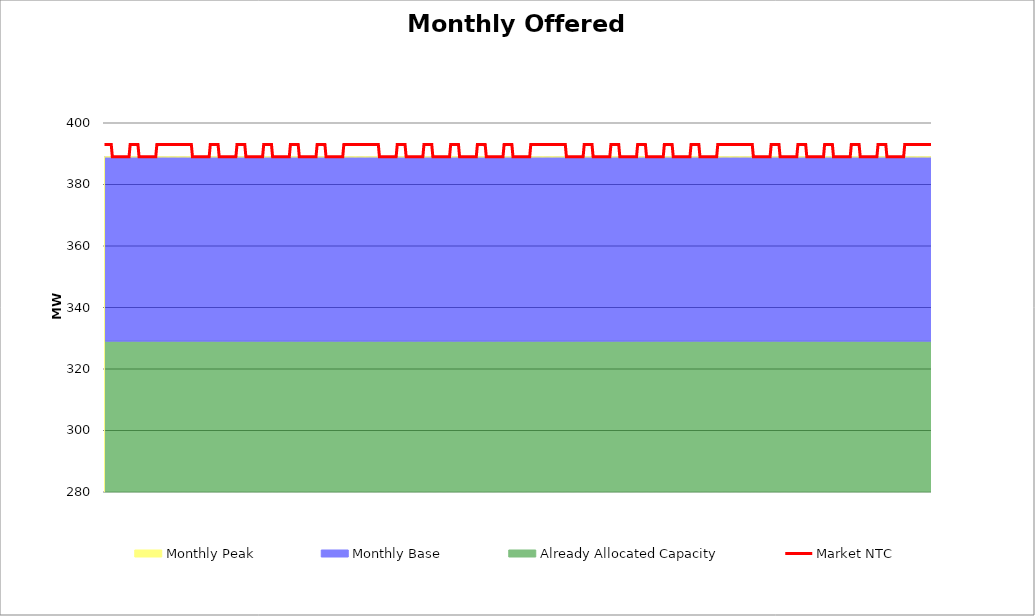
| Category | Market NTC |
|---|---|
| 0 | 393 |
| 1 | 393 |
| 2 | 393 |
| 3 | 393 |
| 4 | 393 |
| 5 | 393 |
| 6 | 393 |
| 7 | 389 |
| 8 | 389 |
| 9 | 389 |
| 10 | 389 |
| 11 | 389 |
| 12 | 389 |
| 13 | 389 |
| 14 | 389 |
| 15 | 389 |
| 16 | 389 |
| 17 | 389 |
| 18 | 389 |
| 19 | 389 |
| 20 | 389 |
| 21 | 389 |
| 22 | 389 |
| 23 | 393 |
| 24 | 393 |
| 25 | 393 |
| 26 | 393 |
| 27 | 393 |
| 28 | 393 |
| 29 | 393 |
| 30 | 393 |
| 31 | 389 |
| 32 | 389 |
| 33 | 389 |
| 34 | 389 |
| 35 | 389 |
| 36 | 389 |
| 37 | 389 |
| 38 | 389 |
| 39 | 389 |
| 40 | 389 |
| 41 | 389 |
| 42 | 389 |
| 43 | 389 |
| 44 | 389 |
| 45 | 389 |
| 46 | 389 |
| 47 | 393 |
| 48 | 393 |
| 49 | 393 |
| 50 | 393 |
| 51 | 393 |
| 52 | 393 |
| 53 | 393 |
| 54 | 393 |
| 55 | 393 |
| 56 | 393 |
| 57 | 393 |
| 58 | 393 |
| 59 | 393 |
| 60 | 393 |
| 61 | 393 |
| 62 | 393 |
| 63 | 393 |
| 64 | 393 |
| 65 | 393 |
| 66 | 393 |
| 67 | 393 |
| 68 | 393 |
| 69 | 393 |
| 70 | 393 |
| 71 | 393 |
| 72 | 393 |
| 73 | 393 |
| 74 | 393 |
| 75 | 393 |
| 76 | 393 |
| 77 | 393 |
| 78 | 393 |
| 79 | 389 |
| 80 | 389 |
| 81 | 389 |
| 82 | 389 |
| 83 | 389 |
| 84 | 389 |
| 85 | 389 |
| 86 | 389 |
| 87 | 389 |
| 88 | 389 |
| 89 | 389 |
| 90 | 389 |
| 91 | 389 |
| 92 | 389 |
| 93 | 389 |
| 94 | 389 |
| 95 | 393 |
| 96 | 393 |
| 97 | 393 |
| 98 | 393 |
| 99 | 393 |
| 100 | 393 |
| 101 | 393 |
| 102 | 393 |
| 103 | 389 |
| 104 | 389 |
| 105 | 389 |
| 106 | 389 |
| 107 | 389 |
| 108 | 389 |
| 109 | 389 |
| 110 | 389 |
| 111 | 389 |
| 112 | 389 |
| 113 | 389 |
| 114 | 389 |
| 115 | 389 |
| 116 | 389 |
| 117 | 389 |
| 118 | 389 |
| 119 | 393 |
| 120 | 393 |
| 121 | 393 |
| 122 | 393 |
| 123 | 393 |
| 124 | 393 |
| 125 | 393 |
| 126 | 393 |
| 127 | 389 |
| 128 | 389 |
| 129 | 389 |
| 130 | 389 |
| 131 | 389 |
| 132 | 389 |
| 133 | 389 |
| 134 | 389 |
| 135 | 389 |
| 136 | 389 |
| 137 | 389 |
| 138 | 389 |
| 139 | 389 |
| 140 | 389 |
| 141 | 389 |
| 142 | 389 |
| 143 | 393 |
| 144 | 393 |
| 145 | 393 |
| 146 | 393 |
| 147 | 393 |
| 148 | 393 |
| 149 | 393 |
| 150 | 393 |
| 151 | 389 |
| 152 | 389 |
| 153 | 389 |
| 154 | 389 |
| 155 | 389 |
| 156 | 389 |
| 157 | 389 |
| 158 | 389 |
| 159 | 389 |
| 160 | 389 |
| 161 | 389 |
| 162 | 389 |
| 163 | 389 |
| 164 | 389 |
| 165 | 389 |
| 166 | 389 |
| 167 | 393 |
| 168 | 393 |
| 169 | 393 |
| 170 | 393 |
| 171 | 393 |
| 172 | 393 |
| 173 | 393 |
| 174 | 393 |
| 175 | 389 |
| 176 | 389 |
| 177 | 389 |
| 178 | 389 |
| 179 | 389 |
| 180 | 389 |
| 181 | 389 |
| 182 | 389 |
| 183 | 389 |
| 184 | 389 |
| 185 | 389 |
| 186 | 389 |
| 187 | 389 |
| 188 | 389 |
| 189 | 389 |
| 190 | 389 |
| 191 | 393 |
| 192 | 393 |
| 193 | 393 |
| 194 | 393 |
| 195 | 393 |
| 196 | 393 |
| 197 | 393 |
| 198 | 393 |
| 199 | 389 |
| 200 | 389 |
| 201 | 389 |
| 202 | 389 |
| 203 | 389 |
| 204 | 389 |
| 205 | 389 |
| 206 | 389 |
| 207 | 389 |
| 208 | 389 |
| 209 | 389 |
| 210 | 389 |
| 211 | 389 |
| 212 | 389 |
| 213 | 389 |
| 214 | 389 |
| 215 | 393 |
| 216 | 393 |
| 217 | 393 |
| 218 | 393 |
| 219 | 393 |
| 220 | 393 |
| 221 | 393 |
| 222 | 393 |
| 223 | 393 |
| 224 | 393 |
| 225 | 393 |
| 226 | 393 |
| 227 | 393 |
| 228 | 393 |
| 229 | 393 |
| 230 | 393 |
| 231 | 393 |
| 232 | 393 |
| 233 | 393 |
| 234 | 393 |
| 235 | 393 |
| 236 | 393 |
| 237 | 393 |
| 238 | 393 |
| 239 | 393 |
| 240 | 393 |
| 241 | 393 |
| 242 | 393 |
| 243 | 393 |
| 244 | 393 |
| 245 | 393 |
| 246 | 393 |
| 247 | 389 |
| 248 | 389 |
| 249 | 389 |
| 250 | 389 |
| 251 | 389 |
| 252 | 389 |
| 253 | 389 |
| 254 | 389 |
| 255 | 389 |
| 256 | 389 |
| 257 | 389 |
| 258 | 389 |
| 259 | 389 |
| 260 | 389 |
| 261 | 389 |
| 262 | 389 |
| 263 | 393 |
| 264 | 393 |
| 265 | 393 |
| 266 | 393 |
| 267 | 393 |
| 268 | 393 |
| 269 | 393 |
| 270 | 393 |
| 271 | 389 |
| 272 | 389 |
| 273 | 389 |
| 274 | 389 |
| 275 | 389 |
| 276 | 389 |
| 277 | 389 |
| 278 | 389 |
| 279 | 389 |
| 280 | 389 |
| 281 | 389 |
| 282 | 389 |
| 283 | 389 |
| 284 | 389 |
| 285 | 389 |
| 286 | 389 |
| 287 | 393 |
| 288 | 393 |
| 289 | 393 |
| 290 | 393 |
| 291 | 393 |
| 292 | 393 |
| 293 | 393 |
| 294 | 393 |
| 295 | 389 |
| 296 | 389 |
| 297 | 389 |
| 298 | 389 |
| 299 | 389 |
| 300 | 389 |
| 301 | 389 |
| 302 | 389 |
| 303 | 389 |
| 304 | 389 |
| 305 | 389 |
| 306 | 389 |
| 307 | 389 |
| 308 | 389 |
| 309 | 389 |
| 310 | 389 |
| 311 | 393 |
| 312 | 393 |
| 313 | 393 |
| 314 | 393 |
| 315 | 393 |
| 316 | 393 |
| 317 | 393 |
| 318 | 393 |
| 319 | 389 |
| 320 | 389 |
| 321 | 389 |
| 322 | 389 |
| 323 | 389 |
| 324 | 389 |
| 325 | 389 |
| 326 | 389 |
| 327 | 389 |
| 328 | 389 |
| 329 | 389 |
| 330 | 389 |
| 331 | 389 |
| 332 | 389 |
| 333 | 389 |
| 334 | 389 |
| 335 | 393 |
| 336 | 393 |
| 337 | 393 |
| 338 | 393 |
| 339 | 393 |
| 340 | 393 |
| 341 | 393 |
| 342 | 393 |
| 343 | 389 |
| 344 | 389 |
| 345 | 389 |
| 346 | 389 |
| 347 | 389 |
| 348 | 389 |
| 349 | 389 |
| 350 | 389 |
| 351 | 389 |
| 352 | 389 |
| 353 | 389 |
| 354 | 389 |
| 355 | 389 |
| 356 | 389 |
| 357 | 389 |
| 358 | 389 |
| 359 | 393 |
| 360 | 393 |
| 361 | 393 |
| 362 | 393 |
| 363 | 393 |
| 364 | 393 |
| 365 | 393 |
| 366 | 393 |
| 367 | 389 |
| 368 | 389 |
| 369 | 389 |
| 370 | 389 |
| 371 | 389 |
| 372 | 389 |
| 373 | 389 |
| 374 | 389 |
| 375 | 389 |
| 376 | 389 |
| 377 | 389 |
| 378 | 389 |
| 379 | 389 |
| 380 | 389 |
| 381 | 389 |
| 382 | 389 |
| 383 | 393 |
| 384 | 393 |
| 385 | 393 |
| 386 | 393 |
| 387 | 393 |
| 388 | 393 |
| 389 | 393 |
| 390 | 393 |
| 391 | 393 |
| 392 | 393 |
| 393 | 393 |
| 394 | 393 |
| 395 | 393 |
| 396 | 393 |
| 397 | 393 |
| 398 | 393 |
| 399 | 393 |
| 400 | 393 |
| 401 | 393 |
| 402 | 393 |
| 403 | 393 |
| 404 | 393 |
| 405 | 393 |
| 406 | 393 |
| 407 | 393 |
| 408 | 393 |
| 409 | 393 |
| 410 | 393 |
| 411 | 393 |
| 412 | 393 |
| 413 | 393 |
| 414 | 393 |
| 415 | 389 |
| 416 | 389 |
| 417 | 389 |
| 418 | 389 |
| 419 | 389 |
| 420 | 389 |
| 421 | 389 |
| 422 | 389 |
| 423 | 389 |
| 424 | 389 |
| 425 | 389 |
| 426 | 389 |
| 427 | 389 |
| 428 | 389 |
| 429 | 389 |
| 430 | 389 |
| 431 | 393 |
| 432 | 393 |
| 433 | 393 |
| 434 | 393 |
| 435 | 393 |
| 436 | 393 |
| 437 | 393 |
| 438 | 393 |
| 439 | 389 |
| 440 | 389 |
| 441 | 389 |
| 442 | 389 |
| 443 | 389 |
| 444 | 389 |
| 445 | 389 |
| 446 | 389 |
| 447 | 389 |
| 448 | 389 |
| 449 | 389 |
| 450 | 389 |
| 451 | 389 |
| 452 | 389 |
| 453 | 389 |
| 454 | 389 |
| 455 | 393 |
| 456 | 393 |
| 457 | 393 |
| 458 | 393 |
| 459 | 393 |
| 460 | 393 |
| 461 | 393 |
| 462 | 393 |
| 463 | 389 |
| 464 | 389 |
| 465 | 389 |
| 466 | 389 |
| 467 | 389 |
| 468 | 389 |
| 469 | 389 |
| 470 | 389 |
| 471 | 389 |
| 472 | 389 |
| 473 | 389 |
| 474 | 389 |
| 475 | 389 |
| 476 | 389 |
| 477 | 389 |
| 478 | 389 |
| 479 | 393 |
| 480 | 393 |
| 481 | 393 |
| 482 | 393 |
| 483 | 393 |
| 484 | 393 |
| 485 | 393 |
| 486 | 393 |
| 487 | 389 |
| 488 | 389 |
| 489 | 389 |
| 490 | 389 |
| 491 | 389 |
| 492 | 389 |
| 493 | 389 |
| 494 | 389 |
| 495 | 389 |
| 496 | 389 |
| 497 | 389 |
| 498 | 389 |
| 499 | 389 |
| 500 | 389 |
| 501 | 389 |
| 502 | 389 |
| 503 | 393 |
| 504 | 393 |
| 505 | 393 |
| 506 | 393 |
| 507 | 393 |
| 508 | 393 |
| 509 | 393 |
| 510 | 393 |
| 511 | 389 |
| 512 | 389 |
| 513 | 389 |
| 514 | 389 |
| 515 | 389 |
| 516 | 389 |
| 517 | 389 |
| 518 | 389 |
| 519 | 389 |
| 520 | 389 |
| 521 | 389 |
| 522 | 389 |
| 523 | 389 |
| 524 | 389 |
| 525 | 389 |
| 526 | 389 |
| 527 | 393 |
| 528 | 393 |
| 529 | 393 |
| 530 | 393 |
| 531 | 393 |
| 532 | 393 |
| 533 | 393 |
| 534 | 393 |
| 535 | 389 |
| 536 | 389 |
| 537 | 389 |
| 538 | 389 |
| 539 | 389 |
| 540 | 389 |
| 541 | 389 |
| 542 | 389 |
| 543 | 389 |
| 544 | 389 |
| 545 | 389 |
| 546 | 389 |
| 547 | 389 |
| 548 | 389 |
| 549 | 389 |
| 550 | 389 |
| 551 | 393 |
| 552 | 393 |
| 553 | 393 |
| 554 | 393 |
| 555 | 393 |
| 556 | 393 |
| 557 | 393 |
| 558 | 393 |
| 559 | 393 |
| 560 | 393 |
| 561 | 393 |
| 562 | 393 |
| 563 | 393 |
| 564 | 393 |
| 565 | 393 |
| 566 | 393 |
| 567 | 393 |
| 568 | 393 |
| 569 | 393 |
| 570 | 393 |
| 571 | 393 |
| 572 | 393 |
| 573 | 393 |
| 574 | 393 |
| 575 | 393 |
| 576 | 393 |
| 577 | 393 |
| 578 | 393 |
| 579 | 393 |
| 580 | 393 |
| 581 | 393 |
| 582 | 393 |
| 583 | 389 |
| 584 | 389 |
| 585 | 389 |
| 586 | 389 |
| 587 | 389 |
| 588 | 389 |
| 589 | 389 |
| 590 | 389 |
| 591 | 389 |
| 592 | 389 |
| 593 | 389 |
| 594 | 389 |
| 595 | 389 |
| 596 | 389 |
| 597 | 389 |
| 598 | 389 |
| 599 | 393 |
| 600 | 393 |
| 601 | 393 |
| 602 | 393 |
| 603 | 393 |
| 604 | 393 |
| 605 | 393 |
| 606 | 393 |
| 607 | 389 |
| 608 | 389 |
| 609 | 389 |
| 610 | 389 |
| 611 | 389 |
| 612 | 389 |
| 613 | 389 |
| 614 | 389 |
| 615 | 389 |
| 616 | 389 |
| 617 | 389 |
| 618 | 389 |
| 619 | 389 |
| 620 | 389 |
| 621 | 389 |
| 622 | 389 |
| 623 | 393 |
| 624 | 393 |
| 625 | 393 |
| 626 | 393 |
| 627 | 393 |
| 628 | 393 |
| 629 | 393 |
| 630 | 393 |
| 631 | 389 |
| 632 | 389 |
| 633 | 389 |
| 634 | 389 |
| 635 | 389 |
| 636 | 389 |
| 637 | 389 |
| 638 | 389 |
| 639 | 389 |
| 640 | 389 |
| 641 | 389 |
| 642 | 389 |
| 643 | 389 |
| 644 | 389 |
| 645 | 389 |
| 646 | 389 |
| 647 | 393 |
| 648 | 393 |
| 649 | 393 |
| 650 | 393 |
| 651 | 393 |
| 652 | 393 |
| 653 | 393 |
| 654 | 393 |
| 655 | 389 |
| 656 | 389 |
| 657 | 389 |
| 658 | 389 |
| 659 | 389 |
| 660 | 389 |
| 661 | 389 |
| 662 | 389 |
| 663 | 389 |
| 664 | 389 |
| 665 | 389 |
| 666 | 389 |
| 667 | 389 |
| 668 | 389 |
| 669 | 389 |
| 670 | 389 |
| 671 | 393 |
| 672 | 393 |
| 673 | 393 |
| 674 | 393 |
| 675 | 393 |
| 676 | 393 |
| 677 | 393 |
| 678 | 393 |
| 679 | 389 |
| 680 | 389 |
| 681 | 389 |
| 682 | 389 |
| 683 | 389 |
| 684 | 389 |
| 685 | 389 |
| 686 | 389 |
| 687 | 389 |
| 688 | 389 |
| 689 | 389 |
| 690 | 389 |
| 691 | 389 |
| 692 | 389 |
| 693 | 389 |
| 694 | 389 |
| 695 | 393 |
| 696 | 393 |
| 697 | 393 |
| 698 | 393 |
| 699 | 393 |
| 700 | 393 |
| 701 | 393 |
| 702 | 393 |
| 703 | 389 |
| 704 | 389 |
| 705 | 389 |
| 706 | 389 |
| 707 | 389 |
| 708 | 389 |
| 709 | 389 |
| 710 | 389 |
| 711 | 389 |
| 712 | 389 |
| 713 | 389 |
| 714 | 389 |
| 715 | 389 |
| 716 | 389 |
| 717 | 389 |
| 718 | 389 |
| 719 | 393 |
| 720 | 393 |
| 721 | 393 |
| 722 | 393 |
| 723 | 393 |
| 724 | 393 |
| 725 | 393 |
| 726 | 393 |
| 727 | 393 |
| 728 | 393 |
| 729 | 393 |
| 730 | 393 |
| 731 | 393 |
| 732 | 393 |
| 733 | 393 |
| 734 | 393 |
| 735 | 393 |
| 736 | 393 |
| 737 | 393 |
| 738 | 393 |
| 739 | 393 |
| 740 | 393 |
| 741 | 393 |
| 742 | 393 |
| 743 | 393 |